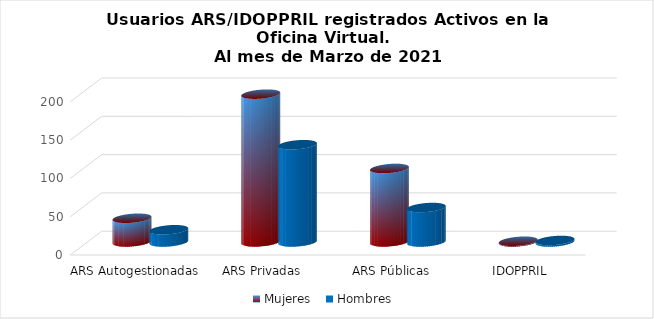
| Category | Mujeres | Hombres |
|---|---|---|
| ARS Autogestionadas | 31 | 16 |
| ARS Privadas | 193 | 127 |
| ARS Públicas | 96 | 45 |
| IDOPPRIL | 1 | 2 |